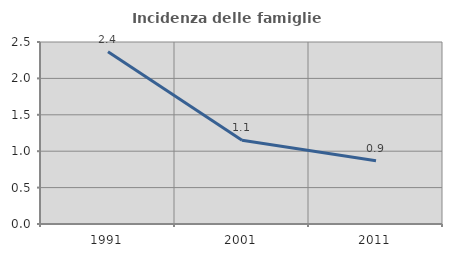
| Category | Incidenza delle famiglie numerose |
|---|---|
| 1991.0 | 2.366 |
| 2001.0 | 1.149 |
| 2011.0 | 0.868 |